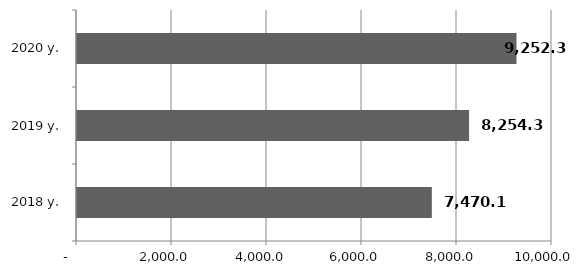
| Category | Series 0 |
|---|---|
| 2018 y. | 7470.085 |
| 2019 y. | 8254.3 |
| 2020 y. | 9252.3 |